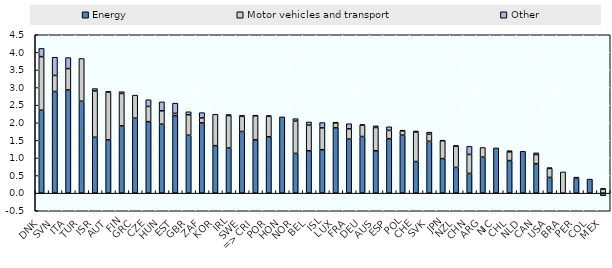
| Category | Energy | Motor vehicles and transport | Other  |
|---|---|---|---|
| DNK | 2.356 | 1.523 | 0.233 |
| SVN | 2.888 | 0.456 | 0.518 |
| ITA | 2.933 | 0.606 | 0.312 |
| TUR | 2.611 | 1.215 | 0 |
| ISR | 1.588 | 1.316 | 0.067 |
| AUT | 1.514 | 1.353 | 0.023 |
| FIN | 1.911 | 0.922 | 0.05 |
| GRC | 2.13 | 0.656 | 0 |
| CZE | 2.031 | 0.432 | 0.191 |
| HUN | 1.96 | 0.38 | 0.253 |
| EST | 2.202 | 0.064 | 0.291 |
| GBR | 1.646 | 0.582 | 0.085 |
| ZAF | 1.997 | 0.141 | 0.15 |
| KOR | 1.35 | 0.89 | 0 |
| IRL | 1.282 | 0.922 | 0.03 |
| SWE | 1.752 | 0.429 | 0.028 |
|  => CRI | 1.518 | 0.683 | 0.006 |
| POR | 1.602 | 0.581 | 0.02 |
| HON | 2.166 | 0 | 0 |
| NOR | 1.129 | 0.915 | 0.072 |
| BEL | 1.205 | 0.729 | 0.088 |
| ISL | 1.235 | 0.62 | 0.15 |
| LUX | 1.86 | 0.141 | 0.003 |
| FRA | 1.537 | 0.29 | 0.146 |
| DEU | 1.61 | 0.325 | 0.009 |
| AUS | 1.204 | 0.66 | 0.047 |
| ESP | 1.547 | 0.235 | 0.103 |
| POL | 1.65 | 0.12 | 0.02 |
| CHE | 0.898 | 0.837 | 0.031 |
| SVK | 1.474 | 0.2 | 0.061 |
| JPN | 0.982 | 0.509 | 0.008 |
| NZL | 0.732 | 0.607 | 0.01 |
| CHN | 0.56 | 0.539 | 0.231 |
| ARG | 1.022 | 0.275 | 0 |
| NIC | 1.285 | 0 | 0 |
| CHL | 0.925 | 0.248 | 0.034 |
| NLD | 1.188 | 0 | 0 |
| CAN | 0.837 | 0.259 | 0.049 |
| USA | 0.447 | 0.255 | 0.021 |
| BRA | 0 | 0.603 | 0 |
| PER | 0.421 | 0.034 | 0 |
| COL | 0.399 | 0 | 0 |
| MEX | -0.075 | 0.118 | 0.012 |